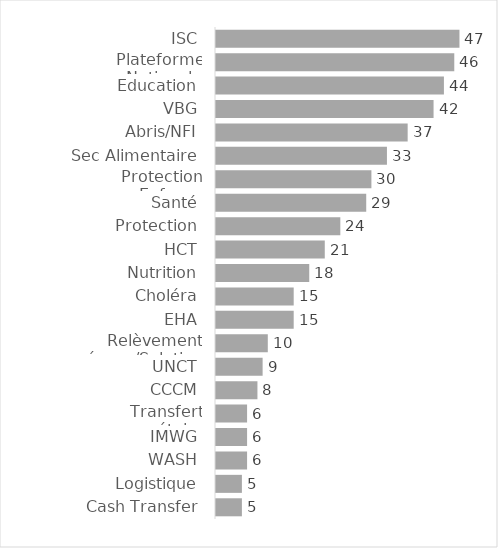
| Category | Total |
|---|---|
| ISC | 47 |
| Plateforme Nationale | 46 |
| Education | 44 |
| VBG | 42 |
| Abris/NFI | 37 |
| Sec Alimentaire | 33 |
| Protection Enfance | 30 |
| Santé | 29 |
| Protection | 24 |
| HCT | 21 |
| Nutrition | 18 |
| Choléra | 15 |
| EHA | 15 |
| Relèvement précoce/Solutions durables | 10 |
| UNCT | 9 |
| CCCM | 8 |
| Transfert monétaire | 6 |
| IMWG | 6 |
| WASH | 6 |
| Logistique | 5 |
| Cash Transfer | 5 |